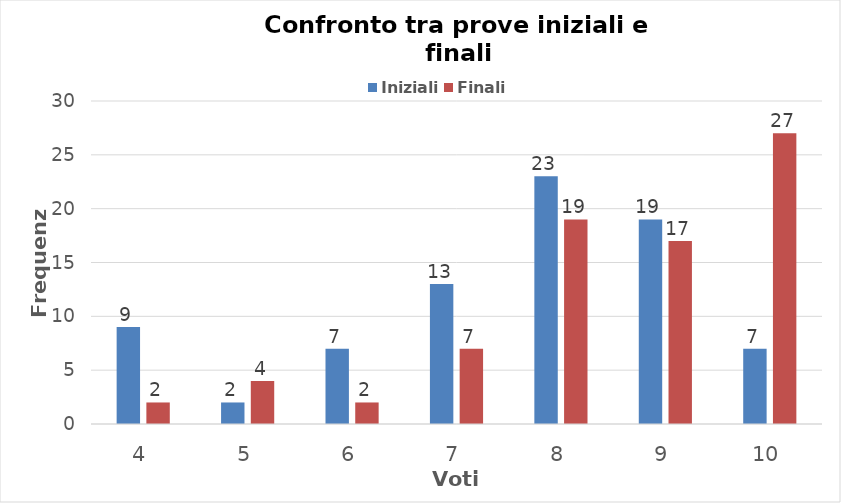
| Category | Iniziali | Finali |
|---|---|---|
| 4.0 | 9 | 2 |
| 5.0 | 2 | 4 |
| 6.0 | 7 | 2 |
| 7.0 | 13 | 7 |
| 8.0 | 23 | 19 |
| 9.0 | 19 | 17 |
| 10.0 | 7 | 27 |